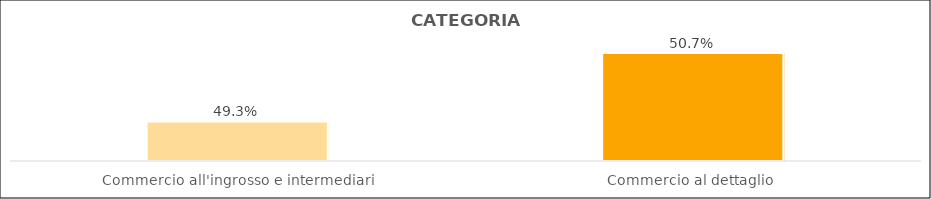
| Category | Series 0 |
|---|---|
| Commercio all'ingrosso e intermediari | 0.493 |
| Commercio al dettaglio  | 0.507 |